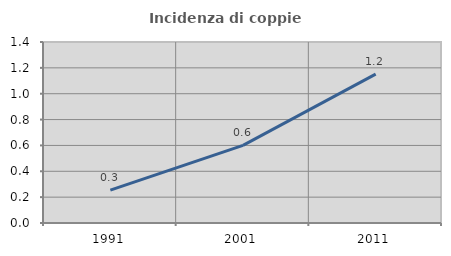
| Category | Incidenza di coppie miste |
|---|---|
| 1991.0 | 0.254 |
| 2001.0 | 0.601 |
| 2011.0 | 1.152 |